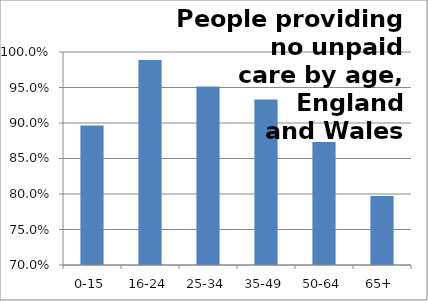
| Category | Series 0 |
|---|---|
| 0-15 | 0.897 |
| 16-24 | 0.989 |
| 25-34 | 0.951 |
| 35-49 | 0.933 |
| 50-64 | 0.873 |
| 65+ | 0.797 |